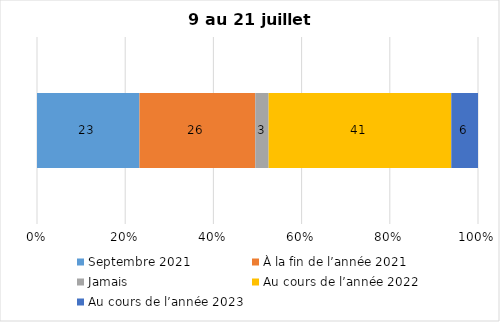
| Category | Septembre 2021 | À la fin de l’année 2021 | Jamais | Au cours de l’année 2022 | Au cours de l’année 2023 |
|---|---|---|---|---|---|
| 0 | 23 | 26 | 3 | 41 | 6 |